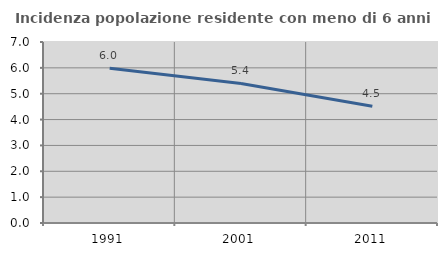
| Category | Incidenza popolazione residente con meno di 6 anni |
|---|---|
| 1991.0 | 5.983 |
| 2001.0 | 5.397 |
| 2011.0 | 4.513 |